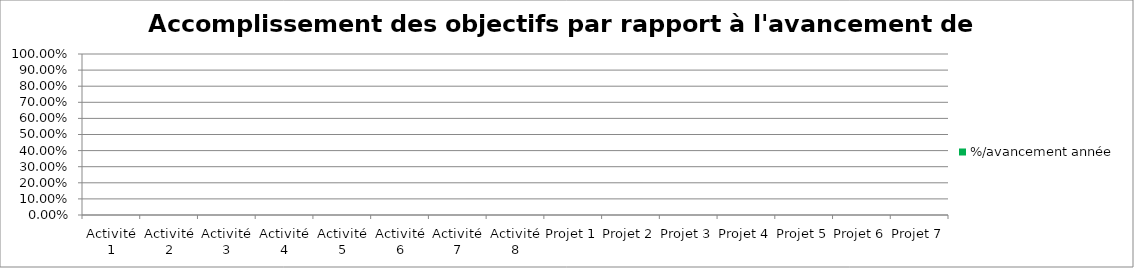
| Category | %/avancement année |
|---|---|
| Activité 1 | 0 |
| Activité 2 | 0 |
| Activité 3 | 0 |
| Activité 4 | 0 |
| Activité 5 | 0 |
| Activité 6 | 0 |
| Activité 7 | 0 |
| Activité 8 | 0 |
| Projet 1 | 0 |
| Projet 2 | 0 |
| Projet 3 | 0 |
| Projet 4 | 0 |
| Projet 5 | 0 |
| Projet 6 | 0 |
| Projet 7 | 0 |